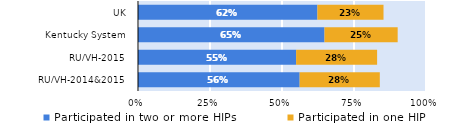
| Category | Participated in two or more HIPs | Participated in one HIP |
|---|---|---|
| RU/VH-2014&2015 | 0.561 | 0.278 |
| RU/VH-2015 | 0.549 | 0.281 |
| Kentucky System | 0.648 | 0.254 |
| UK | 0.623 | 0.23 |